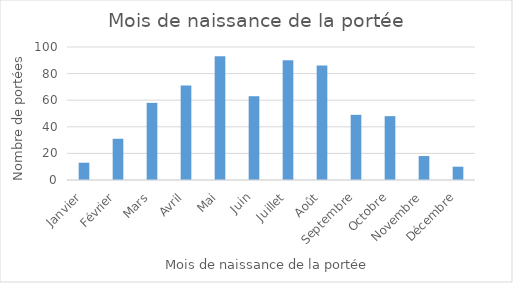
| Category | Series 0 |
|---|---|
| Janvier | 13 |
| Février | 31 |
| Mars | 58 |
| Avril | 71 |
| Mai | 93 |
| Juin | 63 |
| Juillet | 90 |
| Août | 86 |
| Septembre | 49 |
| Octobre | 48 |
| Novembre | 18 |
| Décembre | 10 |